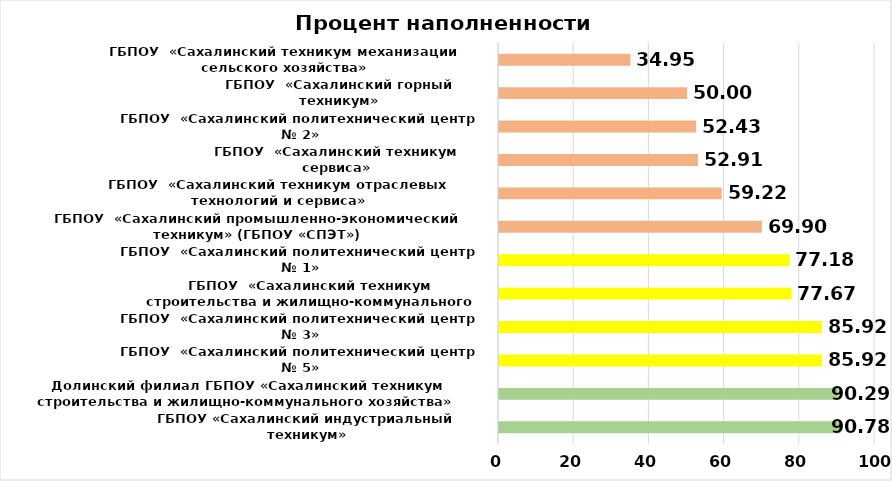
| Category | Series 0 |
|---|---|
| ГБПОУ «Сахалинский индустриальный техникум» | 90.777 |
| Долинский филиал ГБПОУ «Сахалинский техникум строительства и жилищно-коммунального хозяйства»  | 90.291 |
| ГБПОУ  «Сахалинский политехнический центр № 5» | 85.922 |
| ГБПОУ  «Сахалинский политехнический центр № 3» | 85.922 |
| ГБПОУ  «Сахалинский техникум строительства и жилищно-коммунального хозяйства» | 77.67 |
| ГБПОУ  «Сахалинский политехнический центр № 1» | 77.184 |
| ГБПОУ  «Сахалинский промышленно-экономический техникум» (ГБПОУ «СПЭТ») | 69.903 |
| ГБПОУ  «Сахалинский техникум отраслевых технологий и сервиса» | 59.223 |
| ГБПОУ  «Сахалинский техникум сервиса» | 52.913 |
| ГБПОУ  «Сахалинский политехнический центр № 2» | 52.427 |
| ГБПОУ  «Сахалинский горный техникум» | 50 |
| ГБПОУ  «Сахалинский техникум механизации сельского хозяйства» | 34.951 |